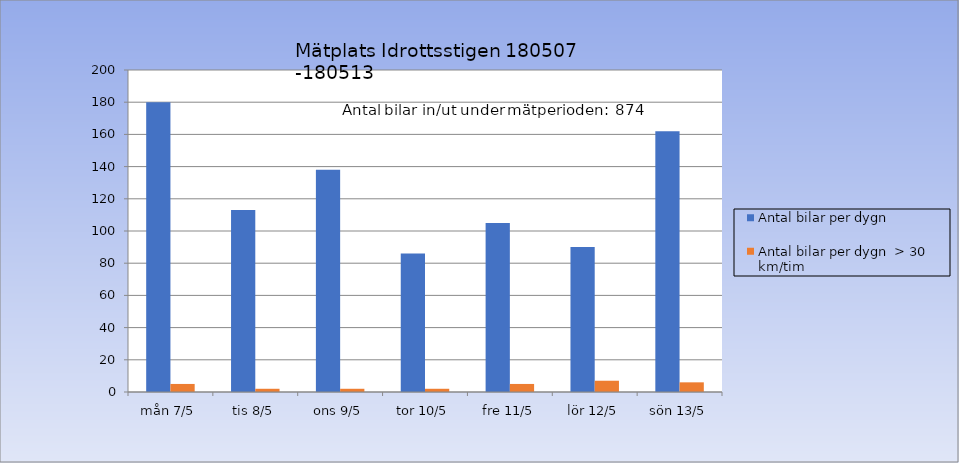
| Category | Antal bilar per dygn | Antal bilar per dygn  > 30 km/tim |
|---|---|---|
| mån 7/5 | 180 | 5 |
| tis 8/5 | 113 | 2 |
| ons 9/5 | 138 | 2 |
| tor 10/5 | 86 | 2 |
| fre 11/5 | 105 | 5 |
| lör 12/5 | 90 | 7 |
| sön 13/5 | 162 | 6 |